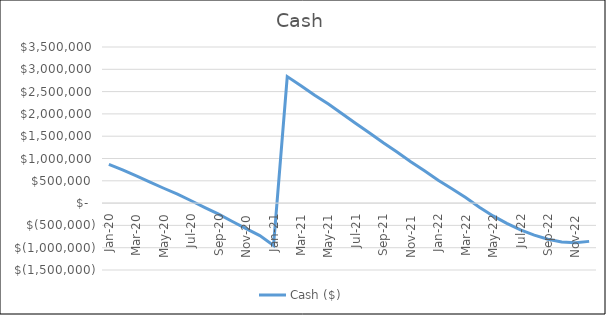
| Category | Cash ($) |
|---|---|
| 2020-01-01 | 865989.418 |
| 2020-02-29 | 744886.643 |
| 2020-03-31 | 612415.7 |
| 2020-04-30 | 472217.611 |
| 2020-05-31 | 332793.466 |
| 2020-06-30 | 199448.607 |
| 2020-07-31 | 52859.37 |
| 2020-08-31 | -99404.707 |
| 2020-09-30 | -246036.027 |
| 2020-10-31 | -412524.522 |
| 2020-11-30 | -573908.049 |
| 2020-12-31 | -727913.207 |
| 2021-01-31 | -949113.642 |
| 2021-02-28 | 2836657.807 |
| 2021-03-31 | 2633259.623 |
| 2021-04-30 | 2419644.623 |
| 2021-05-31 | 2221139.392 |
| 2021-06-30 | 2003427.459 |
| 2021-07-31 | 1786475.035 |
| 2021-08-31 | 1570055.968 |
| 2021-09-30 | 1352105.747 |
| 2021-10-31 | 1144897.004 |
| 2021-11-30 | 926414.669 |
| 2021-12-31 | 724831.818 |
| 2022-01-31 | 511811.802 |
| 2022-02-28 | 323330.79 |
| 2022-03-31 | 126325.745 |
| 2022-04-30 | -90598.978 |
| 2022-05-31 | -287076.285 |
| 2022-06-30 | -454888.137 |
| 2022-07-31 | -601444.902 |
| 2022-08-31 | -716976.856 |
| 2022-09-30 | -809791.666 |
| 2022-10-31 | -873222.284 |
| 2022-11-30 | -890691.392 |
| 2022-12-31 | -858336.734 |